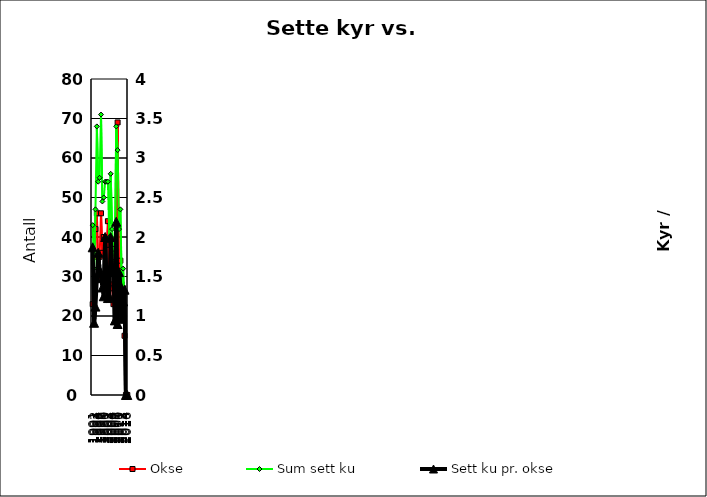
| Category | Okse | Sum sett ku |
|---|---|---|
| 1991.0 | 23 | 43 |
| 1992.0 | 35 | 32 |
| 1993.0 | 42 | 47 |
| 1994.0 | 46 | 68 |
| 1995.0 | 30 | 54 |
| 1996.0 | 35 | 55 |
| 1997.0 | 46 | 71 |
| 1998.0 | 36 | 49 |
| 1999.0 | 40 | 50 |
| 2000.0 | 27 | 54 |
| 2001.0 | 38 | 54 |
| 2002.0 | 44 | 54 |
| 2003.0 | 32 | 40 |
| 2004.0 | 28 | 56 |
| 2005.0 | 27 | 42 |
| 2006.0 | 23 | 37 |
| 2007.0 | 36 | 34 |
| 2008.0 | 31 | 68 |
| 2009.0 | 69 | 62 |
| 2010.0 | 27 | 42 |
| 2011.0 | 34 | 47 |
| 2012.0 | 28 | 27 |
| 2013.0 | 27 | 32 |
| 2014.0 | 15 | 20 |
| 2015.0 | 0 | 0 |
| 2016.0 | 0 | 0 |